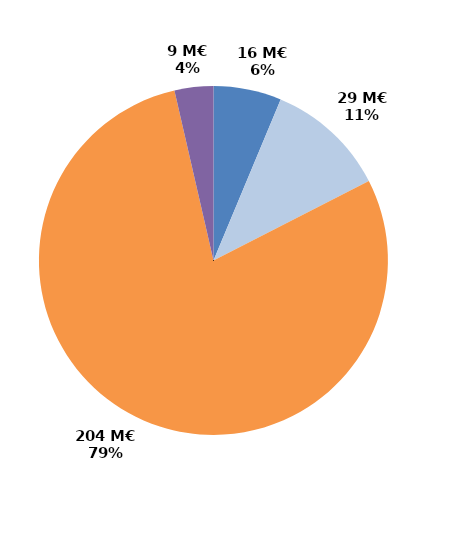
| Category | Series 0 |
|---|---|
| CIF - CPF | 16.229 |
| Période de professionnalisation | 28.841 |
| Plan de formation | 203.611 |
| Autres | 9.275 |